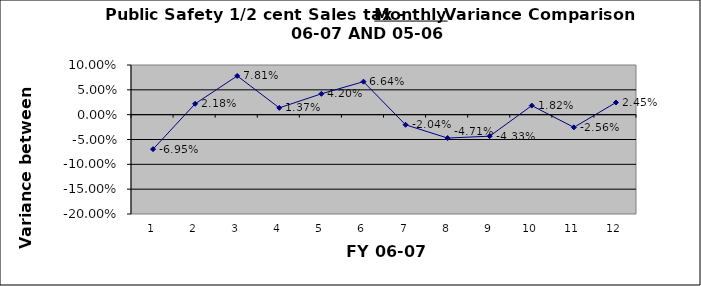
| Category | September October November December January February March April May June  July August |
|---|---|
| 0 | -0.069 |
| 1 | 0.022 |
| 2 | 0.078 |
| 3 | 0.014 |
| 4 | 0.042 |
| 5 | 0.066 |
| 6 | -0.02 |
| 7 | -0.047 |
| 8 | -0.043 |
| 9 | 0.018 |
| 10 | -0.026 |
| 11 | 0.024 |